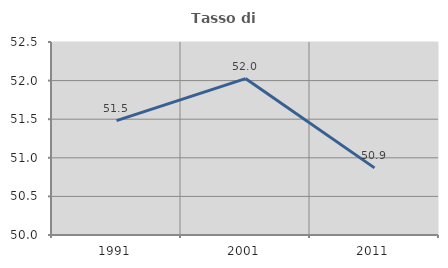
| Category | Tasso di occupazione   |
|---|---|
| 1991.0 | 51.482 |
| 2001.0 | 52.026 |
| 2011.0 | 50.869 |